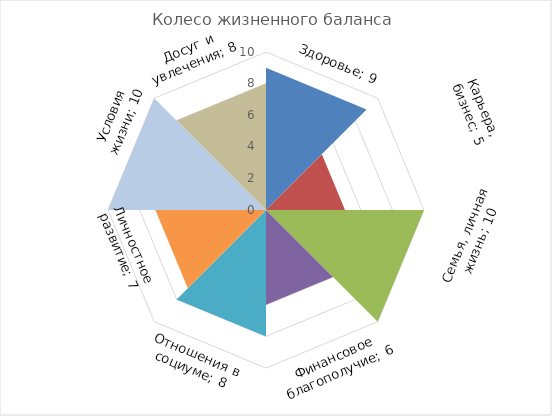
| Category | Series 0 | Series 1 | Series 2 | Series 3 | Series 4 | Series 5 | Series 6 | Series 7 |
|---|---|---|---|---|---|---|---|---|
| Здоровье; 9 | 9 | 0 | 0 | 0 | 0 | 0 | 0 | 8 |
| Карьера, бизнес; 5 | 9 | 5 | 0 | 0 | 0 | 0 | 0 | 0 |
| Семья, личная жизнь; 10 | 0 | 5 | 10 | 0 | 0 | 0 | 0 | 0 |
| Финансовое благополучие; 6 | 0 | 0 | 10 | 6 | 0 | 0 | 0 | 0 |
| Отношения в социуме; 8 | 0 | 0 | 0 | 6 | 8 | 0 | 0 | 0 |
| Личностное развитие; 7 | 0 | 0 | 0 | 0 | 8 | 7 | 0 | 0 |
| Условия жизни; 10 | 0 | 0 | 0 | 0 | 0 | 7 | 10 | 0 |
| Досуг и увлечения; 8 | 0 | 0 | 0 | 0 | 0 | 0 | 10 | 8 |